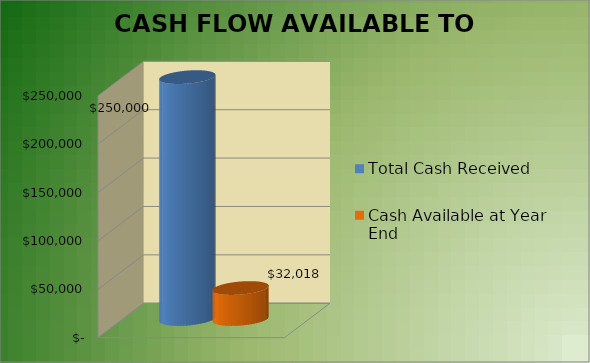
| Category | Total Cash Received | Cash Available at Year End |
|---|---|---|
| 0 | 250000 | 32017.8 |